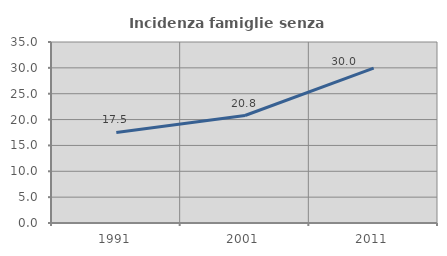
| Category | Incidenza famiglie senza nuclei |
|---|---|
| 1991.0 | 17.503 |
| 2001.0 | 20.787 |
| 2011.0 | 29.962 |